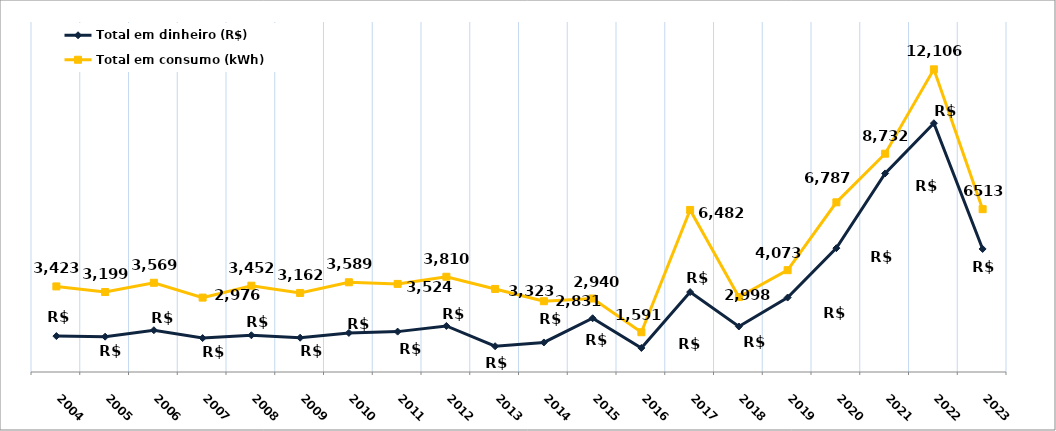
| Category | Total em dinheiro (R$) | Total em consumo (kWh) |
|---|---|---|
| 2004.0 | 1436.49 | 3423 |
| 2005.0 | 1413.1 | 3199 |
| 2006.0 | 1671.83 | 3569 |
| 2007.0 | 1356.62 | 2976 |
| 2008.0 | 1469.45 | 3452 |
| 2009.0 | 1371.85 | 3162 |
| 2010.0 | 1563.85 | 3589 |
| 2011.0 | 1615.32 | 3524 |
| 2012.0 | 1841.71 | 3810 |
| 2013.0 | 1031.04 | 3323 |
| 2014.0 | 1181.69 | 2831 |
| 2015.0 | 2149.91 | 2940 |
| 2016.0 | 961.81 | 1591 |
| 2017.0 | 3196.48 | 6482 |
| 2018.0 | 1820.12 | 2998 |
| 2019.0 | 2978.61 | 4073 |
| 2020.0 | 4954 | 6787 |
| 2021.0 | 7942.78 | 8732 |
| 2022.0 | 9950.89 | 12106 |
| 2023.0 | 4921.81 | 6513 |